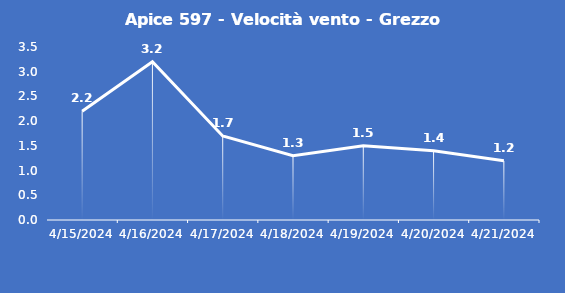
| Category | Apice 597 - Velocità vento - Grezzo (m/s) |
|---|---|
| 4/15/24 | 2.2 |
| 4/16/24 | 3.2 |
| 4/17/24 | 1.7 |
| 4/18/24 | 1.3 |
| 4/19/24 | 1.5 |
| 4/20/24 | 1.4 |
| 4/21/24 | 1.2 |